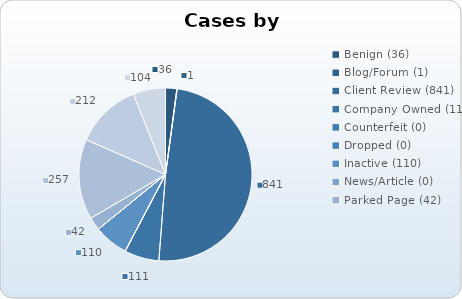
| Category | # Cases |
|---|---|
| Benign (36) | 36 |
| Blog/Forum (1) | 1 |
| Client Review (841) | 841 |
| Company Owned (111) | 111 |
| Counterfeit (0) | 0 |
| Dropped (0) | 0 |
| Inactive (110) | 110 |
| News/Article (0) | 0 |
| Parked Page (42) | 42 |
| Pay Per Click (257) | 257 |
| Traffic Diversion (212) | 212 |
| Unauthorized Use (104) | 104 |